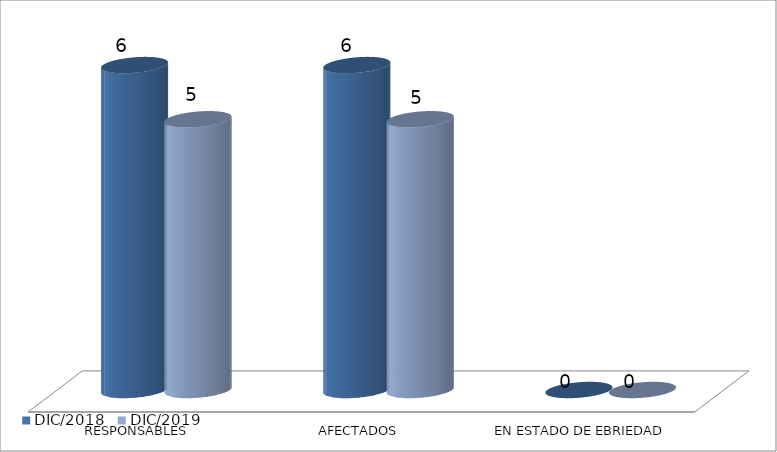
| Category | DIC/2018 | DIC/2019 |
|---|---|---|
| RESPONSABLES | 6 | 5 |
| AFECTADOS | 6 | 5 |
| EN ESTADO DE EBRIEDAD | 0 | 0 |